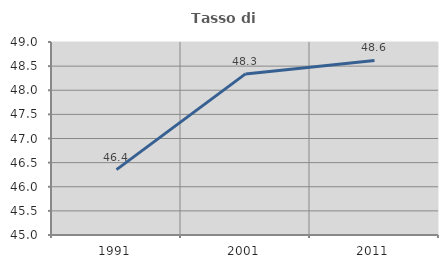
| Category | Tasso di occupazione   |
|---|---|
| 1991.0 | 46.355 |
| 2001.0 | 48.339 |
| 2011.0 | 48.618 |